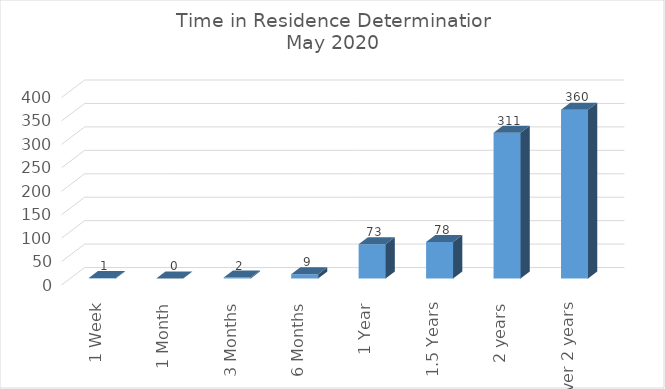
| Category | Series 0 |
|---|---|
| 1 Week | 1 |
| 1 Month | 0 |
| 3 Months | 2 |
| 6 Months | 9 |
| 1 Year | 73 |
| 1.5 Years | 78 |
| 2 years | 311 |
| Over 2 years | 360 |